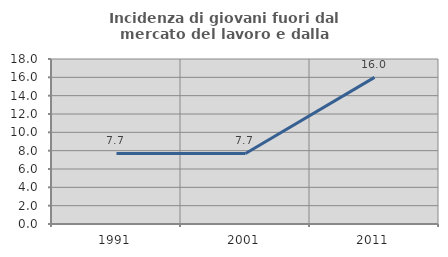
| Category | Incidenza di giovani fuori dal mercato del lavoro e dalla formazione  |
|---|---|
| 1991.0 | 7.692 |
| 2001.0 | 7.692 |
| 2011.0 | 16 |